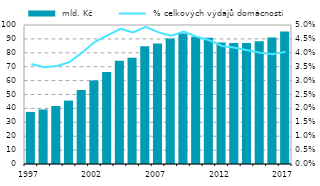
| Category |  mld. Kč |
|---|---|
| 1997.0 | 37.442 |
| 1998.0 | 39.238 |
| 1999.0 | 41.694 |
| 2000.0 | 45.597 |
| 2001.0 | 53.227 |
| 2002.0 | 60.134 |
| 2003.0 | 66.257 |
| 2004.0 | 74.326 |
| 2005.0 | 76.397 |
| 2006.0 | 84.712 |
| 2007.0 | 86.742 |
| 2008.0 | 90.292 |
| 2009.0 | 93.922 |
| 2010.0 | 91.486 |
| 2011.0 | 90.847 |
| 2012.0 | 87.469 |
| 2013.0 | 87.07 |
| 2014.0 | 86.984 |
| 2015.0 | 88.331 |
| 2016.0 | 90.96 |
| 2017.0 | 95.342 |